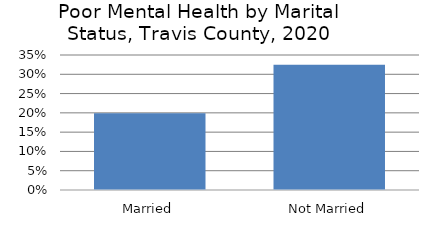
| Category | Series 0 |
|---|---|
| Married | 0.199 |
| Not Married | 0.325 |